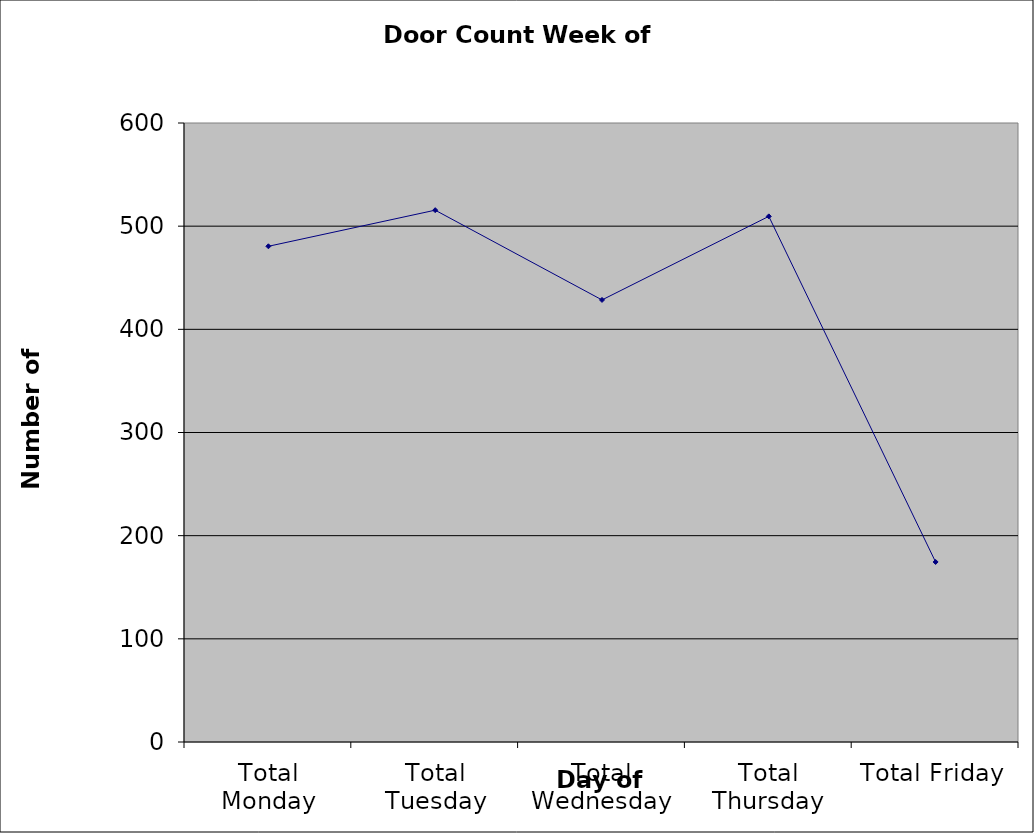
| Category | Series 0 |
|---|---|
| Total Monday | 480.5 |
| Total Tuesday | 515.5 |
| Total Wednesday | 428.5 |
| Total Thursday | 509.5 |
| Total Friday | 174.5 |